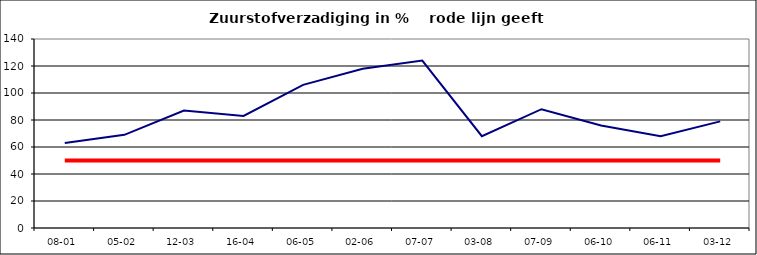
| Category | Series 0 | Series 1 |
|---|---|---|
| 08-01 | 63 | 50 |
| 05-02 | 69 | 50 |
| 12-03 | 87 | 50 |
| 16-04 | 83 | 50 |
| 06-05 | 106 | 50 |
| 02-06 | 118 | 50 |
| 07-07 | 124 | 50 |
| 03-08 | 68 | 50 |
| 07-09 | 88 | 50 |
| 06-10 | 76 | 50 |
| 06-11 | 68 | 50 |
| 03-12 | 79 | 50 |